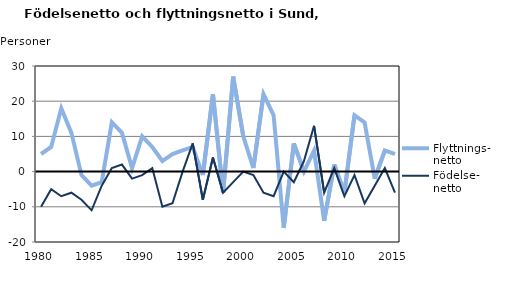
| Category | Flyttnings- netto | Födelse- netto |
|---|---|---|
| 1980.0 | 5 | -10 |
| 1981.0 | 7 | -5 |
| 1982.0 | 18 | -7 |
| 1983.0 | 11 | -6 |
| 1984.0 | -1 | -8 |
| 1985.0 | -4 | -11 |
| 1986.0 | -3 | -4 |
| 1987.0 | 14 | 1 |
| 1988.0 | 11 | 2 |
| 1989.0 | 1 | -2 |
| 1990.0 | 10 | -1 |
| 1991.0 | 7 | 1 |
| 1992.0 | 3 | -10 |
| 1993.0 | 5 | -9 |
| 1994.0 | 6 | 0 |
| 1995.0 | 7 | 8 |
| 1996.0 | -1 | -8 |
| 1997.0 | 22 | 4 |
| 1998.0 | -6 | -6 |
| 1999.0 | 27 | -3 |
| 2000.0 | 10 | 0 |
| 2001.0 | 1 | -1 |
| 2002.0 | 22 | -6 |
| 2003.0 | 16 | -7 |
| 2004.0 | -16 | 0 |
| 2005.0 | 8 | -3 |
| 2006.0 | 0 | 3 |
| 2007.0 | 6 | 13 |
| 2008.0 | -14 | -6 |
| 2009.0 | 2 | 1 |
| 2010.0 | -6 | -7 |
| 2011.0 | 16 | -1 |
| 2012.0 | 14 | -9 |
| 2013.0 | -2 | -4 |
| 2014.0 | 6 | 1 |
| 2015.0 | 5 | -6 |